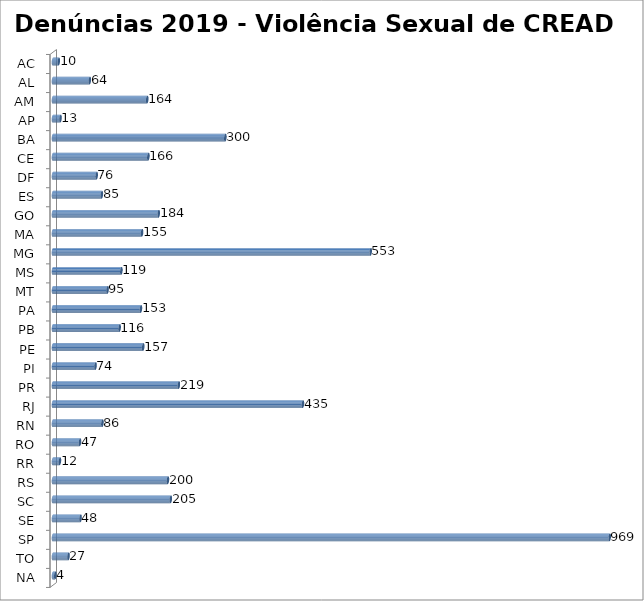
| Category | Series 0 |
|---|---|
| AC | 10 |
| AL | 64 |
| AM | 164 |
| AP | 13 |
| BA | 300 |
| CE | 166 |
| DF | 76 |
| ES | 85 |
| GO | 184 |
| MA | 155 |
| MG | 553 |
| MS | 119 |
| MT | 95 |
| PA | 153 |
| PB | 116 |
| PE | 157 |
| PI | 74 |
| PR | 219 |
| RJ | 435 |
| RN | 86 |
| RO | 47 |
| RR | 12 |
| RS | 200 |
| SC | 205 |
| SE | 48 |
| SP | 969 |
| TO | 27 |
| NA | 4 |